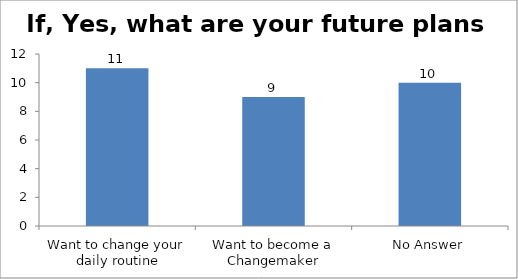
| Category | If, Yes, what are your future plans now? |
|---|---|
| Want to change your daily routine | 11 |
| Want to become a Changemaker | 9 |
| No Answer | 10 |